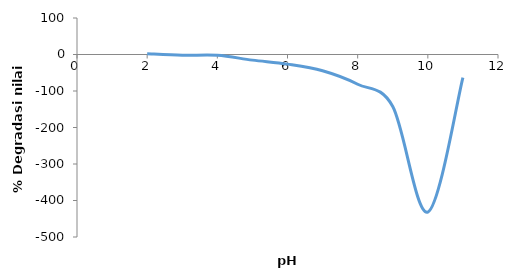
| Category | b |
|---|---|
| 2.0 | 1.957 |
| 3.0 | -2.17 |
| 4.0 | -2.156 |
| 5.0 | -15.411 |
| 6.0 | -26.387 |
| 7.0 | -44.568 |
| 8.0 | -81.437 |
| 9.0 | -142.479 |
| 10.0 | -431.555 |
| 11.0 | -63.026 |